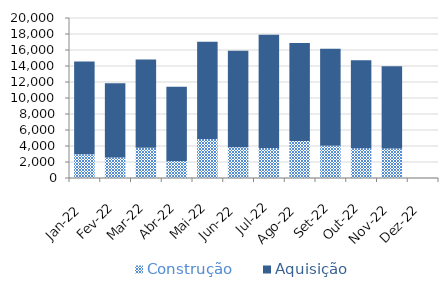
| Category | Construção | Aquisição  |
|---|---|---|
| Jan-22 | 2956.438 | 11598.93 |
| Fev-22 | 2568.19 | 9260.524 |
| Mar-22 | 3770.358 | 11052.944 |
| Abr-22 | 2115.17 | 9299.957 |
| Mai-22 | 4882.226 | 12149.951 |
| Jun-22 | 3857.194 | 12056.964 |
| Jul-22 | 3753.536 | 14142.473 |
| Ago-22 | 4622.491 | 12246.6 |
| Set-22 | 4023.024 | 12118.6 |
| Out-22 | 3734.188 | 10978.131 |
| Nov-22 | 3698.434 | 10275.405 |
| Dez-22 | 0 | 0 |